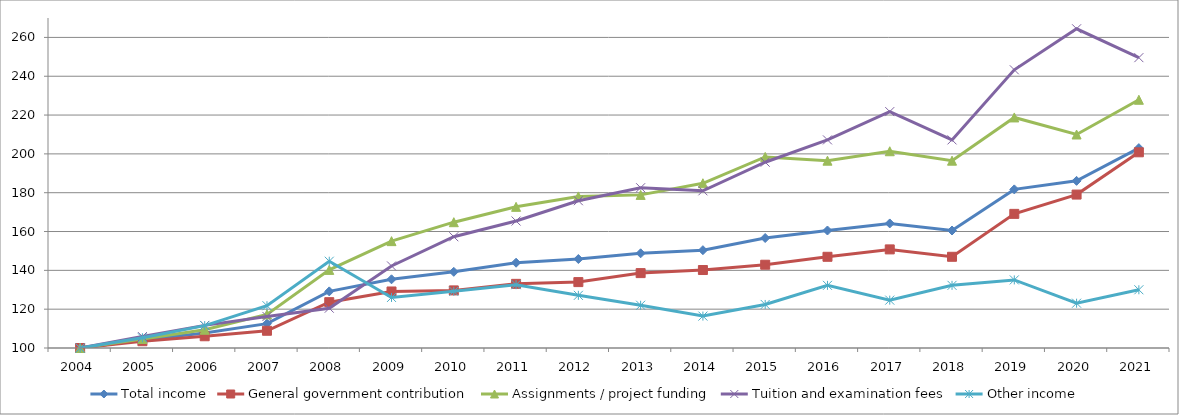
| Category | Total income | General government contribution | Assignments / project funding | Tuition and examination fees | Other income  |
|---|---|---|---|---|---|
| 2004.0 | 100 | 100 | 100 | 100 | 100 |
| 2005.0 | 104.092 | 103.499 | 104.629 | 105.881 | 105.274 |
| 2006.0 | 107.725 | 106.046 | 109.4 | 111.65 | 111.532 |
| 2007.0 | 112.54 | 108.881 | 117.297 | 116.238 | 121.792 |
| 2008.0 | 129.159 | 123.607 | 140.241 | 120.507 | 144.7 |
| 2009.0 | 135.394 | 129.117 | 155.052 | 142.268 | 126.04 |
| 2010.0 | 139.236 | 129.673 | 164.812 | 157.305 | 129.194 |
| 2011.0 | 143.936 | 133.048 | 172.718 | 165.412 | 132.613 |
| 2012.0 | 145.837 | 133.95 | 178.088 | 175.878 | 127.131 |
| 2013.0 | 148.786 | 138.576 | 178.882 | 182.576 | 122.028 |
| 2014.0 | 150.389 | 140.17 | 184.857 | 180.975 | 116.442 |
| 2015.0 | 156.657 | 142.9 | 198.435 | 195.707 | 122.426 |
| 2016.0 | 160.529 | 146.987 | 196.5 | 207.207 | 132.276 |
| 2017.0 | 164.164 | 150.797 | 201.356 | 221.776 | 124.656 |
| 2018.0 | 160.529 | 146.987 | 196.5 | 207.207 | 132.276 |
| 2019.0 | 181.715 | 169.102 | 218.77 | 243.315 | 135.073 |
| 2020.0 | 186.11 | 179.038 | 209.981 | 264.447 | 123.084 |
| 2021.0 | 202.971 | 200.812 | 227.875 | 249.578 | 129.992 |